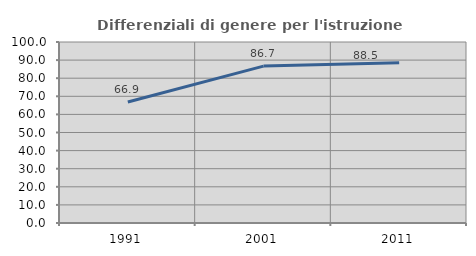
| Category | Differenziali di genere per l'istruzione superiore |
|---|---|
| 1991.0 | 66.888 |
| 2001.0 | 86.678 |
| 2011.0 | 88.523 |